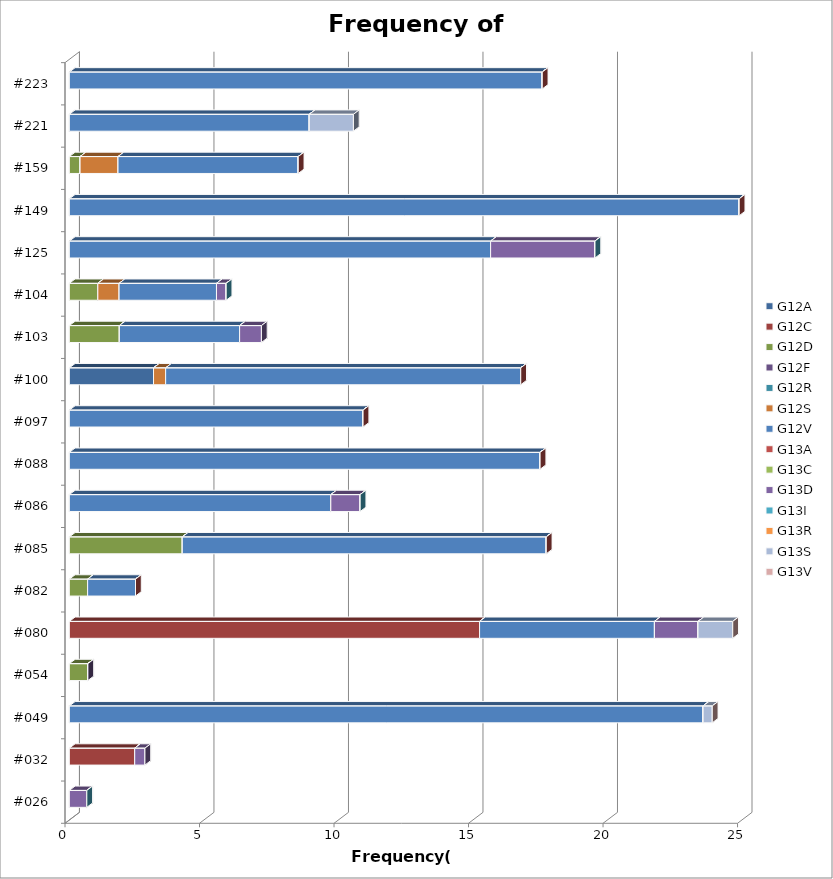
| Category | G12A | G12C | G12D | G12F | G12R | G12S | G12V | G13A | G13C | G13D | G13I | G13R | G13S | G13V |
|---|---|---|---|---|---|---|---|---|---|---|---|---|---|---|
| #026 | 0 | 0 | 0 | 0 | 0 | 0 | 0 | 0 | 0 | 0.65 | 0 | 0 | 0 | 0 |
| #032 | 0 | 2.43 | 0 | 0 | 0 | 0 | 0 | 0 | 0 | 0.38 | 0 | 0 | 0 | 0 |
| #049 | 0 | 0 | 0 | 0 | 0 | 0 | 23.56 | 0 | 0 | 0 | 0 | 0 | 0.34 | 0 |
| #054 | 0 | 0 | 0.69 | 0 | 0 | 0 | 0 | 0 | 0 | 0 | 0 | 0 | 0 | 0 |
| #080 | 0 | 15.25 | 0 | 0 | 0 | 0 | 6.5 | 0 | 0 | 1.62 | 0 | 0 | 1.29 | 0 |
| #082 | 0 | 0 | 0.68 | 0 | 0 | 0 | 1.78 | 0 | 0 | 0 | 0 | 0 | 0 | 0 |
| #085 | 0 | 0 | 4.2 | 0 | 0 | 0 | 13.53 | 0 | 0 | 0 | 0 | 0 | 0 | 0 |
| #086 | 0 | 0 | 0 | 0 | 0 | 0 | 9.72 | 0 | 0 | 1.09 | 0 | 0 | 0 | 0 |
| #088 | 0 | 0 | 0 | 0 | 0 | 0 | 17.5 | 0 | 0 | 0 | 0 | 0 | 0 | 0 |
| #097 | 0 | 0 | 0 | 0 | 0 | 0 | 10.92 | 0 | 0 | 0 | 0 | 0 | 0 | 0 |
| #100 | 3.13 | 0 | 0 | 0 | 0 | 0.45 | 13.2 | 0 | 0 | 0 | 0 | 0 | 0 | 0 |
| #103 | 0 | 0 | 1.86 | 0 | 0 | 0 | 4.47 | 0 | 0 | 0.81 | 0 | 0 | 0 | 0 |
| #104 | 0 | 0 | 1.06 | 0 | 0 | 0.79 | 3.62 | 0 | 0 | 0.36 | 0 | 0 | 0 | 0 |
| #125 | 0 | 0 | 0 | 0 | 0 | 0 | 15.66 | 0 | 0 | 3.88 | 0 | 0 | 0 | 0 |
| #149 | 0 | 0 | 0 | 0 | 0 | 0 | 24.9 | 0 | 0 | 0 | 0 | 0 | 0 | 0 |
| #159 | 0 | 0 | 0.4 | 0 | 0 | 1.41 | 6.7 | 0 | 0 | 0 | 0 | 0 | 0 | 0 |
| #221 | 0 | 0 | 0 | 0 | 0 | 0 | 8.92 | 0 | 0 | 0 | 0 | 0 | 1.64 | 0 |
| #223 | 0 | 0 | 0 | 0 | 0 | 0 | 17.58 | 0 | 0 | 0 | 0 | 0 | 0 | 0 |